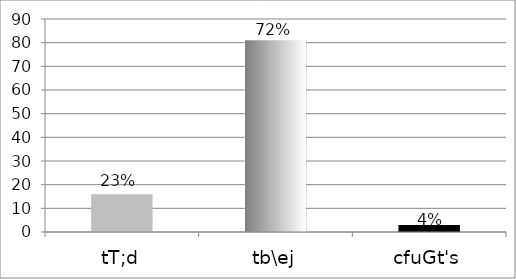
| Category | Series 0 |
|---|---|
| tT;d | 16 |
| tb\ej | 81 |
| cfuGt's | 3 |